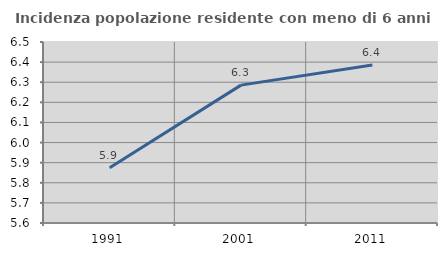
| Category | Incidenza popolazione residente con meno di 6 anni |
|---|---|
| 1991.0 | 5.875 |
| 2001.0 | 6.286 |
| 2011.0 | 6.385 |